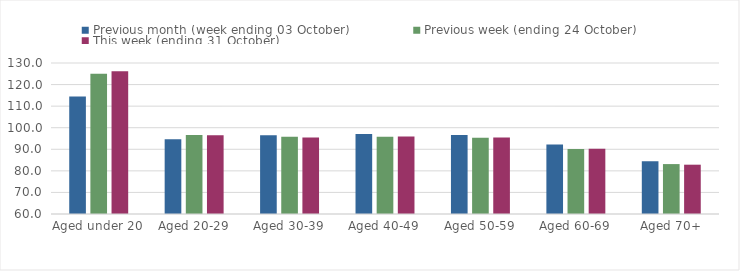
| Category | Previous month (week ending 03 October) | Previous week (ending 24 October) | This week (ending 31 October) |
|---|---|---|---|
| Aged under 20 | 114.49 | 125.01 | 126.2 |
| Aged 20-29 | 94.67 | 96.67 | 96.46 |
| Aged 30-39 | 96.46 | 95.81 | 95.41 |
| Aged 40-49 | 97.09 | 95.79 | 95.9 |
| Aged 50-59 | 96.63 | 95.35 | 95.41 |
| Aged 60-69 | 92.24 | 90.14 | 90.28 |
| Aged 70+ | 84.46 | 83.14 | 82.86 |